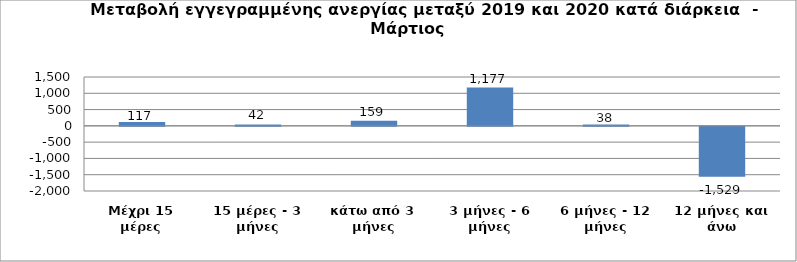
| Category | Series 0 |
|---|---|
| Μέχρι 15 μέρες | 117 |
| 15 μέρες - 3 μήνες | 42 |
| κάτω από 3 μήνες | 159 |
| 3 μήνες - 6 μήνες | 1177 |
| 6 μήνες - 12 μήνες | 38 |
| 12 μήνες και άνω | -1529 |